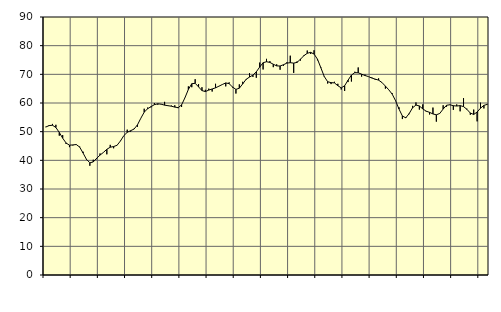
| Category | Piggar | Series 1 |
|---|---|---|
| nan | 51.7 | 51.6 |
| 87.0 | 52.3 | 52.12 |
| 87.0 | 52.7 | 52.24 |
| 87.0 | 52.4 | 51.45 |
| nan | 48.6 | 49.73 |
| 88.0 | 48.8 | 47.73 |
| 88.0 | 45.7 | 46.05 |
| 88.0 | 44.6 | 45.28 |
| nan | 45.2 | 45.38 |
| 89.0 | 45.6 | 45.51 |
| 89.0 | 44.8 | 44.62 |
| 89.0 | 43 | 42.55 |
| nan | 40.1 | 40.34 |
| 90.0 | 38.1 | 39.14 |
| 90.0 | 40.2 | 39.44 |
| 90.0 | 40.4 | 40.71 |
| nan | 42.4 | 41.83 |
| 91.0 | 42.8 | 42.77 |
| 91.0 | 42.1 | 43.85 |
| 91.0 | 45.4 | 44.57 |
| nan | 44.2 | 44.81 |
| 92.0 | 45.3 | 45.25 |
| 92.0 | 46.8 | 46.74 |
| 92.0 | 48.6 | 48.62 |
| nan | 50.7 | 49.78 |
| 93.0 | 50 | 50.34 |
| 93.0 | 51 | 50.9 |
| 93.0 | 51.7 | 52.35 |
| nan | 54.7 | 54.68 |
| 94.0 | 58 | 56.8 |
| 94.0 | 58.4 | 58 |
| 94.0 | 58.5 | 58.73 |
| nan | 60 | 59.42 |
| 95.0 | 59.4 | 59.73 |
| 95.0 | 59.5 | 59.58 |
| 95.0 | 60.4 | 59.25 |
| nan | 59.1 | 59.06 |
| 96.0 | 59.1 | 58.88 |
| 96.0 | 59.2 | 58.57 |
| 96.0 | 58.2 | 58.38 |
| nan | 58.6 | 59.33 |
| 97.0 | 61.9 | 61.85 |
| 97.0 | 65.8 | 64.73 |
| 97.0 | 65.5 | 66.73 |
| nan | 68.3 | 66.87 |
| 98.0 | 66.6 | 65.62 |
| 98.0 | 65.5 | 64.33 |
| 98.0 | 64.6 | 63.98 |
| nan | 65 | 64.5 |
| 99.0 | 64 | 64.89 |
| 99.0 | 66.7 | 65.29 |
| 99.0 | 65.9 | 65.87 |
| nan | 66.5 | 66.45 |
| 0.0 | 65.8 | 67 |
| 0.0 | 67.2 | 66.75 |
| 0.0 | 65.4 | 65.57 |
| nan | 63.3 | 64.75 |
| 1.0 | 66.5 | 65.16 |
| 1.0 | 67.4 | 66.67 |
| 1.0 | 68.1 | 68.26 |
| nan | 70.4 | 69.05 |
| 2.0 | 69.1 | 69.73 |
| 2.0 | 68.8 | 70.87 |
| 2.0 | 74.1 | 72.55 |
| nan | 71.7 | 74.05 |
| 3.0 | 75.4 | 74.39 |
| 3.0 | 74.6 | 74.16 |
| 3.0 | 72.5 | 73.52 |
| nan | 73.5 | 72.94 |
| 4.0 | 71.6 | 72.91 |
| 4.0 | 73 | 73.35 |
| 4.0 | 74.2 | 73.92 |
| nan | 76.5 | 74.06 |
| 5.0 | 70.5 | 73.91 |
| 5.0 | 74.5 | 74.17 |
| 5.0 | 74.8 | 75.28 |
| nan | 76.7 | 76.5 |
| 6.0 | 78.3 | 77.34 |
| 6.0 | 77.1 | 77.67 |
| 6.0 | 78.4 | 77.08 |
| nan | 74.9 | 75.3 |
| 7.0 | 72.5 | 72.3 |
| 7.0 | 69.4 | 69.25 |
| 7.0 | 66.8 | 67.43 |
| nan | 66.6 | 67.1 |
| 8.0 | 67.4 | 67.01 |
| 8.0 | 66.7 | 66.03 |
| 8.0 | 64.7 | 65.28 |
| nan | 64.2 | 66.02 |
| 9.0 | 67.3 | 67.95 |
| 9.0 | 67.5 | 69.74 |
| 9.0 | 70.9 | 70.59 |
| nan | 72.4 | 70.54 |
| 10.0 | 69.2 | 70.06 |
| 10.0 | 69.9 | 69.59 |
| 10.0 | 69.2 | 69.22 |
| nan | 68.9 | 68.71 |
| 11.0 | 68.1 | 68.33 |
| 11.0 | 68.6 | 67.97 |
| 11.0 | 67.2 | 67.13 |
| nan | 65 | 65.9 |
| 12.0 | 64.6 | 64.6 |
| 12.0 | 63.4 | 63.1 |
| 12.0 | 60.7 | 60.79 |
| nan | 58.5 | 57.91 |
| 13.0 | 54.4 | 55.47 |
| 13.0 | 55.1 | 54.82 |
| 13.0 | 56.1 | 56.31 |
| nan | 59 | 58.33 |
| 14.0 | 60.2 | 59.29 |
| 14.0 | 57.7 | 58.97 |
| 14.0 | 59.5 | 57.94 |
| nan | 57 | 57.16 |
| 15.0 | 56 | 56.74 |
| 15.0 | 58.4 | 56.18 |
| 15.0 | 53.5 | 55.88 |
| nan | 56.4 | 56.35 |
| 16.0 | 59.2 | 57.89 |
| 16.0 | 58.7 | 59.21 |
| 16.0 | 59.3 | 59.38 |
| nan | 57.6 | 59.06 |
| 17.0 | 59.5 | 58.94 |
| 17.0 | 57.1 | 59.09 |
| 17.0 | 61.7 | 58.75 |
| nan | 58 | 57.79 |
| 18.0 | 55.9 | 56.5 |
| 18.0 | 57.7 | 56 |
| 18.0 | 53.6 | 56.86 |
| nan | 60.1 | 58.19 |
| 19.0 | 58.1 | 59.17 |
| 19.0 | 59.7 | 59.53 |